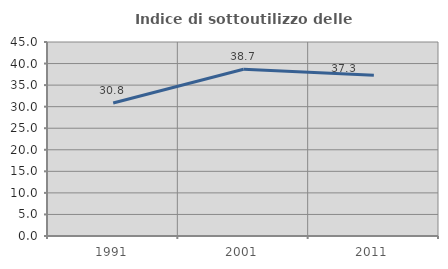
| Category | Indice di sottoutilizzo delle abitazioni  |
|---|---|
| 1991.0 | 30.833 |
| 2001.0 | 38.686 |
| 2011.0 | 37.267 |